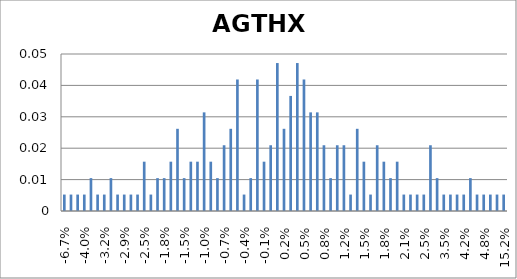
| Category | Series 0 |
|---|---|
| -0.067 | 0.005 |
| -0.06 | 0.005 |
| -0.047 | 0.005 |
| -0.04 | 0.005 |
| -0.038 | 0.01 |
| -0.036 | 0.005 |
| -0.032 | 0.005 |
| -0.031 | 0.01 |
| -0.03 | 0.005 |
| -0.029 | 0.005 |
| -0.028 | 0.005 |
| -0.026 | 0.005 |
| -0.025 | 0.016 |
| -0.02 | 0.005 |
| -0.019 | 0.01 |
| -0.018 | 0.01 |
| -0.017 | 0.016 |
| -0.016 | 0.026 |
| -0.015 | 0.01 |
| -0.013 | 0.016 |
| -0.011 | 0.016 |
| -0.01 | 0.031 |
| -0.009 | 0.016 |
| -0.008 | 0.01 |
| -0.007 | 0.021 |
| -0.006 | 0.026 |
| -0.005 | 0.042 |
| -0.004 | 0.005 |
| -0.003 | 0.01 |
| -0.002 | 0.042 |
| -0.001 | 0.016 |
| 0.0 | 0.021 |
| 0.001 | 0.047 |
| 0.002 | 0.026 |
| 0.003 | 0.037 |
| 0.004 | 0.047 |
| 0.005 | 0.042 |
| 0.006 | 0.031 |
| 0.007 | 0.031 |
| 0.008 | 0.021 |
| 0.009 | 0.01 |
| 0.01 | 0.021 |
| 0.012 | 0.021 |
| 0.013 | 0.005 |
| 0.014 | 0.026 |
| 0.015 | 0.016 |
| 0.016 | 0.005 |
| 0.017 | 0.021 |
| 0.018 | 0.016 |
| 0.019 | 0.01 |
| 0.02 | 0.016 |
| 0.021 | 0.005 |
| 0.022 | 0.005 |
| 0.024 | 0.005 |
| 0.025 | 0.005 |
| 0.027 | 0.021 |
| 0.033 | 0.01 |
| 0.035 | 0.005 |
| 0.036 | 0.005 |
| 0.039 | 0.005 |
| 0.042 | 0.005 |
| 0.043 | 0.01 |
| 0.044 | 0.005 |
| 0.048 | 0.005 |
| 0.05 | 0.005 |
| 0.071 | 0.005 |
| 0.152 | 0.005 |